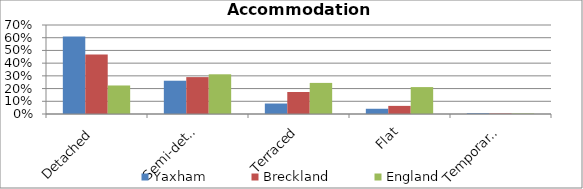
| Category | Yaxham | Breckland | England |
|---|---|---|---|
| Detached | 0.609 | 0.469 | 0.224 |
| Semi-detached | 0.262 | 0.29 | 0.312 |
| Terraced | 0.082 | 0.173 | 0.245 |
| Flat | 0.041 | 0.064 | 0.212 |
| Temporary or mobile home | 0.006 | 0.004 | 0.004 |